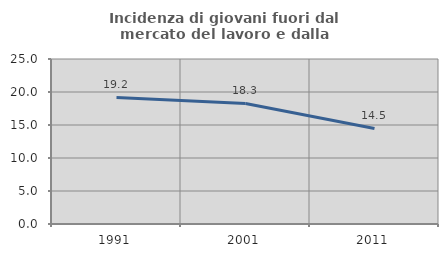
| Category | Incidenza di giovani fuori dal mercato del lavoro e dalla formazione  |
|---|---|
| 1991.0 | 19.175 |
| 2001.0 | 18.263 |
| 2011.0 | 14.47 |